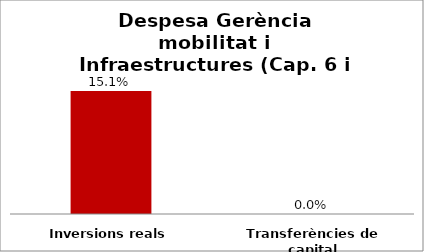
| Category | Series 0 |
|---|---|
| Inversions reals | 0.151 |
| Transferències de capital | 0 |